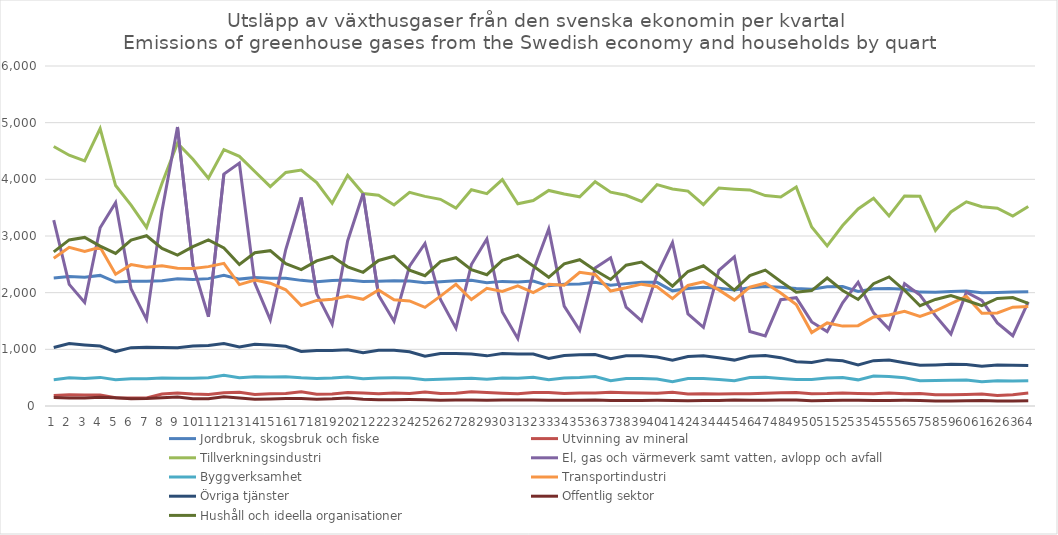
| Category | Jordbruk, skogsbruk och fiske | Utvinning av mineral | Tillverkningsindustri | El, gas och värmeverk samt vatten, avlopp och avfall | Byggverksamhet | Transportindustri | Övriga tjänster | Offentlig sektor | Hushåll och ideella organisationer |
|---|---|---|---|---|---|---|---|---|---|
| 0 | 2260.848 | 185.962 | 4578.899 | 3279.683 | 464.044 | 2607.952 | 1033.649 | 150.44 | 2719.727 |
| 1 | 2286.257 | 200.156 | 4425.907 | 2146.335 | 496.387 | 2799.156 | 1100.972 | 141.241 | 2931.138 |
| 2 | 2272.381 | 195.54 | 4324.84 | 1827.897 | 485.309 | 2726.802 | 1077.575 | 140.014 | 2975.186 |
| 3 | 2304.546 | 194.731 | 4894.985 | 3144.55 | 504.873 | 2799.986 | 1058.025 | 155.557 | 2820.773 |
| 4 | 2186.566 | 145.146 | 3890.715 | 3587.569 | 464.707 | 2325.805 | 960.595 | 146.574 | 2692.079 |
| 5 | 2201.515 | 139.984 | 3543.81 | 2069.216 | 481.652 | 2495.172 | 1029.776 | 129.964 | 2927.136 |
| 6 | 2201.36 | 143.291 | 3150.389 | 1528.904 | 479.648 | 2448.657 | 1036.371 | 132.277 | 3003.989 |
| 7 | 2212.188 | 212.557 | 3931.27 | 3447.592 | 493.188 | 2474.359 | 1032.389 | 147.419 | 2779.591 |
| 8 | 2243.901 | 227.761 | 4637.207 | 4923.631 | 489.55 | 2432.119 | 1027.479 | 158.467 | 2664.425 |
| 9 | 2233.464 | 210.478 | 4354.753 | 2482.979 | 489.142 | 2426.793 | 1057.434 | 126.331 | 2813.303 |
| 10 | 2247.821 | 204.828 | 4018.728 | 1575.296 | 496.868 | 2459.518 | 1066.555 | 127.807 | 2929.524 |
| 11 | 2305.424 | 234.065 | 4523.762 | 4092.339 | 542.577 | 2518.116 | 1100.54 | 161.645 | 2788.502 |
| 12 | 2239.274 | 243.983 | 4406.12 | 4286.169 | 498.005 | 2142.729 | 1043.241 | 139.274 | 2498.751 |
| 13 | 2267.652 | 204.716 | 4137.348 | 2168.697 | 516.313 | 2223.842 | 1089.766 | 119.427 | 2703.49 |
| 14 | 2254.576 | 214.159 | 3871.577 | 1521.553 | 510.871 | 2166.832 | 1078.045 | 122.804 | 2741.631 |
| 15 | 2256.314 | 222.06 | 4122.246 | 2761.527 | 516.769 | 2050.357 | 1053.32 | 130.694 | 2510.572 |
| 16 | 2217.071 | 253.192 | 4164.515 | 3678.631 | 497.882 | 1770.979 | 962.031 | 133.007 | 2406.093 |
| 17 | 2193.878 | 206.7 | 3941.719 | 1978.614 | 486.684 | 1863.858 | 981.395 | 121.087 | 2560.656 |
| 18 | 2214.019 | 213.665 | 3577.301 | 1445.954 | 494.828 | 1884.181 | 981.458 | 127.495 | 2639.046 |
| 19 | 2225.004 | 238.615 | 4070.834 | 2911.842 | 509.634 | 1940.766 | 992.75 | 140.189 | 2456.646 |
| 20 | 2197.829 | 228.863 | 3749.202 | 3749.445 | 481.105 | 1882.828 | 939.851 | 119.08 | 2359.145 |
| 21 | 2202.972 | 216.603 | 3718.39 | 1954.447 | 494.005 | 2046.037 | 984.313 | 111.444 | 2568.341 |
| 22 | 2209.693 | 230.361 | 3547.314 | 1497.007 | 497.367 | 1873.397 | 982.114 | 112.268 | 2643.465 |
| 23 | 2203.985 | 221.294 | 3769.109 | 2466.005 | 496.036 | 1853.504 | 956.656 | 113.179 | 2398.025 |
| 24 | 2175.013 | 245.045 | 3698.95 | 2867.982 | 463.708 | 1740.124 | 878.597 | 109.928 | 2299.153 |
| 25 | 2191.314 | 219.407 | 3647.325 | 1878.718 | 471.899 | 1939.443 | 927.688 | 102.493 | 2548.219 |
| 26 | 2210.034 | 225.665 | 3491.041 | 1373.903 | 482.181 | 2147.073 | 926.11 | 107.244 | 2616.225 |
| 27 | 2217.521 | 249.597 | 3816.424 | 2495.568 | 489.34 | 1878.386 | 916.43 | 107.446 | 2407.459 |
| 28 | 2176.486 | 236.841 | 3747.957 | 2946.146 | 473.103 | 2077.419 | 884.803 | 103.372 | 2316.795 |
| 29 | 2199.201 | 224.41 | 3994.854 | 1659.581 | 494.927 | 2020.729 | 925.46 | 103.943 | 2569.307 |
| 30 | 2188.756 | 217.113 | 3569.281 | 1191.137 | 490.396 | 2120.385 | 919.102 | 106.604 | 2661.119 |
| 31 | 2205.863 | 240.049 | 3625.068 | 2387.697 | 508.381 | 2001.832 | 917.973 | 107.452 | 2471.97 |
| 32 | 2120.437 | 239.961 | 3803.736 | 3122.313 | 464.351 | 2147.172 | 838.841 | 103.3 | 2271.12 |
| 33 | 2150.361 | 218.608 | 3740.424 | 1762.836 | 492.324 | 2132.289 | 889.562 | 100.335 | 2507.424 |
| 34 | 2153.735 | 227.677 | 3692.258 | 1335.955 | 501.671 | 2359.833 | 902.599 | 102.213 | 2581.84 |
| 35 | 2182.294 | 229.421 | 3959.227 | 2435.829 | 521.203 | 2321.343 | 908.166 | 106.478 | 2396.625 |
| 36 | 2132.279 | 241.995 | 3774.099 | 2616.059 | 445.613 | 2029.506 | 833.265 | 99.045 | 2232.725 |
| 37 | 2159.667 | 233.092 | 3719.041 | 1744.157 | 485.331 | 2085.69 | 885.442 | 97.453 | 2485.26 |
| 38 | 2183.911 | 227.447 | 3610.166 | 1502.091 | 486.405 | 2150.188 | 887.958 | 99.035 | 2539.377 |
| 39 | 2182.18 | 225.971 | 3906.378 | 2316.288 | 476.075 | 2104.412 | 865.437 | 99.462 | 2344.426 |
| 40 | 2031.935 | 244.632 | 3829.473 | 2883.087 | 430.269 | 1893.988 | 807.495 | 95.047 | 2114.438 |
| 41 | 2074.117 | 210.166 | 3792.345 | 1626.298 | 483.237 | 2127.331 | 874.579 | 94.817 | 2373.646 |
| 42 | 2094.527 | 215.707 | 3554.19 | 1386.951 | 487.265 | 2191.286 | 886.397 | 97.981 | 2475.342 |
| 43 | 2077.645 | 211.225 | 3845.852 | 2393.202 | 466.624 | 2048.84 | 850.289 | 97.238 | 2266.588 |
| 44 | 2045.663 | 217.082 | 3826.374 | 2632.658 | 447.275 | 1869.455 | 809.906 | 106.303 | 2045.19 |
| 45 | 2086.93 | 217.65 | 3812.52 | 1314.164 | 502.597 | 2096.159 | 877.799 | 100.411 | 2301.239 |
| 46 | 2109.574 | 226.911 | 3713.762 | 1237.849 | 506.539 | 2169.598 | 889.646 | 101.1 | 2397.279 |
| 47 | 2093.9 | 232.702 | 3686.841 | 1876.388 | 485.179 | 1992.289 | 852.831 | 104.724 | 2196.199 |
| 48 | 2073.198 | 238.376 | 3864.266 | 1910.782 | 467.504 | 1788.971 | 780.104 | 106.615 | 2009.479 |
| 49 | 2061.967 | 217.696 | 3159.883 | 1483.794 | 466.52 | 1295.523 | 767.99 | 92.46 | 2037.382 |
| 50 | 2106.082 | 219.425 | 2824.614 | 1312.469 | 495.275 | 1465.414 | 818.195 | 97.407 | 2259.033 |
| 51 | 2108.422 | 229.169 | 3183.691 | 1819.185 | 500.795 | 1410.08 | 799.713 | 101.659 | 2039.086 |
| 52 | 2021.594 | 221.297 | 3478.234 | 2184.257 | 461.466 | 1417.985 | 723.255 | 100.147 | 1879.746 |
| 53 | 2067.377 | 216.138 | 3667.346 | 1643.003 | 527.787 | 1571.824 | 800.217 | 96.4 | 2159.191 |
| 54 | 2075.406 | 228.315 | 3354.982 | 1356.572 | 520.109 | 1604.857 | 810.108 | 97.386 | 2277.316 |
| 55 | 2060.095 | 216.253 | 3707.186 | 2157.247 | 497.908 | 1669.947 | 764.584 | 99.353 | 2042.575 |
| 56 | 2009.833 | 220.579 | 3701.026 | 1956.401 | 447.722 | 1579.267 | 718.196 | 97.97 | 1770.08 |
| 57 | 2006.233 | 198.45 | 3098.982 | 1595.388 | 449.007 | 1680.315 | 725.035 | 86.972 | 1880.161 |
| 58 | 2018.702 | 197.37 | 3423.956 | 1269.179 | 453.035 | 1806.228 | 736.647 | 87.418 | 1950.292 |
| 59 | 2027.707 | 204.371 | 3603.312 | 2007.651 | 459.435 | 1933.681 | 733.112 | 94.361 | 1861.073 |
| 60 | 1997.819 | 210.669 | 3517.132 | 1864.545 | 429.317 | 1638.212 | 702.37 | 97.099 | 1769.789 |
| 61 | 2004.605 | 185.024 | 3491.533 | 1465.857 | 445.232 | 1641.966 | 722.66 | 87.21 | 1898.699 |
| 62 | 2009.686 | 199.266 | 3350.611 | 1239.925 | 441.548 | 1744.525 | 719.634 | 86.065 | 1913.558 |
| 63 | 2016.844 | 227.619 | 3521.81 | 1837.356 | 445.891 | 1756.32 | 712.652 | 92.623 | 1812.299 |